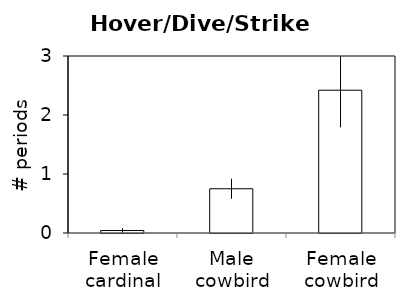
| Category | Series 0 |
|---|---|
| Female cardinal | 0.042 |
| Male cowbird | 0.75 |
| Female cowbird | 2.42 |